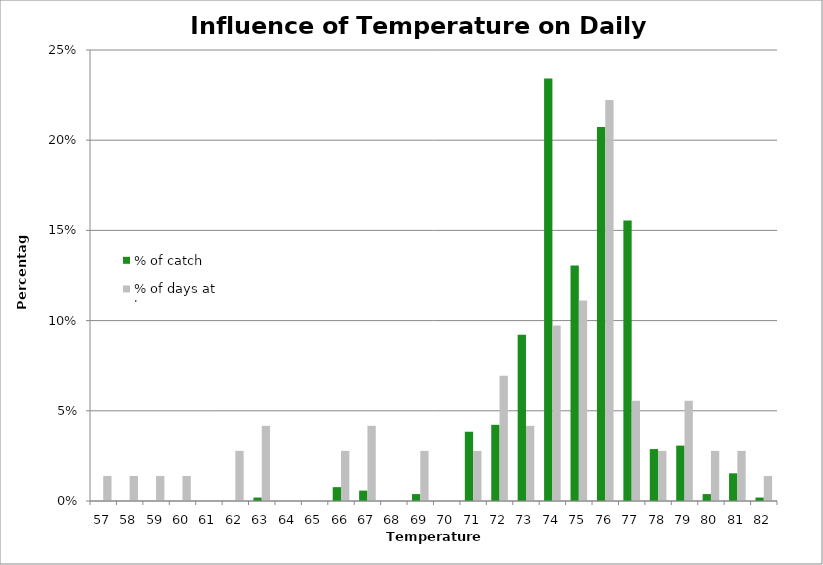
| Category | % of catch | % of days at temp |
|---|---|---|
| 57.0 | 0 | 0.014 |
| 58.0 | 0 | 0.014 |
| 59.0 | 0 | 0.014 |
| 60.0 | 0 | 0.014 |
| 61.0 | 0 | 0 |
| 62.0 | 0 | 0.028 |
| 63.0 | 0.002 | 0.042 |
| 64.0 | 0 | 0 |
| 65.0 | 0 | 0 |
| 66.0 | 0.008 | 0.028 |
| 67.0 | 0.006 | 0.042 |
| 68.0 | 0 | 0 |
| 69.0 | 0.004 | 0.028 |
| 70.0 | 0 | 0 |
| 71.0 | 0.038 | 0.028 |
| 72.0 | 0.042 | 0.069 |
| 73.0 | 0.092 | 0.042 |
| 74.0 | 0.234 | 0.097 |
| 75.0 | 0.131 | 0.111 |
| 76.0 | 0.207 | 0.222 |
| 77.0 | 0.155 | 0.056 |
| 78.0 | 0.029 | 0.028 |
| 79.0 | 0.031 | 0.056 |
| 80.0 | 0.004 | 0.028 |
| 81.0 | 0.015 | 0.028 |
| 82.0 | 0.002 | 0.014 |